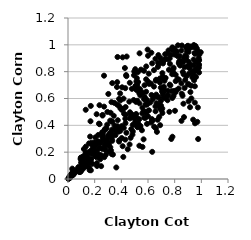
| Category | Series 0 |
|---|---|
| 0.7836342504068851 | 0.805 |
| 0.5610615064754484 | 0.641 |
| 0.04253485079842576 | 0.037 |
| 0.919891491295028 | 0.851 |
| 0.9515869209305778 | 0.691 |
| 0.5205785303169262 | 0.39 |
| 0.3262155400384781 | 0.573 |
| 0.6446854060187953 | 0.811 |
| 0.535160524778381 | 0.248 |
| 0.5935872876621674 | 0.503 |
| 0.534909024585252 | 0.446 |
| 0.2595380502048091 | 0.343 |
| 0.8655837116887714 | 0.561 |
| 0.13361825662190904 | 0.241 |
| 0.6056085689123091 | 0.785 |
| 0.20532825203499436 | 0.21 |
| 0.1688141165076407 | 0.43 |
| 0.10783027642858285 | 0.103 |
| 0.8670050182637795 | 0.78 |
| 0.2764689434769459 | 0.246 |
| 0.13324119266326725 | 0.173 |
| 0.9051945486520051 | 0.873 |
| 0.25927888224184875 | 0.477 |
| 0.1350354829395176 | 0.191 |
| 0.8743601571822789 | 0.679 |
| 0.032825821279329315 | 0.039 |
| 0.30267499963031913 | 0.321 |
| 0.35803701581496883 | 0.383 |
| 0.5424560325676623 | 0.384 |
| 0.37026893233019714 | 0.368 |
| 0.7836252910030995 | 0.969 |
| 0.5458763430222952 | 0.646 |
| 0.2592710910028215 | 0.31 |
| 0.9817306644293472 | 0.829 |
| 0.36732922168364524 | 0.686 |
| 0.23712059282582626 | 0.409 |
| 0.9587434187647836 | 0.869 |
| 0.9112938751995172 | 0.84 |
| 0.18794761554298456 | 0.2 |
| 0.5696512092485299 | 0.806 |
| 0.9761535961713298 | 0.298 |
| 0.1330325787023337 | 0.516 |
| 0.8441632748105674 | 0.881 |
| 0.09441787526968488 | 0.149 |
| 0.42963028463660735 | 0.449 |
| 0.25678347864624784 | 0.349 |
| 0.9414454121000605 | 0.848 |
| 0.6870681243370528 | 0.529 |
| 0.4718904579547721 | 0.475 |
| 0.5366587110782195 | 0.937 |
| 0.7826272741505005 | 0.604 |
| 0.21505620234439843 | 0.211 |
| 0.12257094637206437 | 0.121 |
| 0.19162183388206872 | 0.23 |
| 0.012228305892225474 | 0.02 |
| 0.08497778606495338 | 0.053 |
| 0.24195788789625264 | 0.147 |
| 0.7277438120638807 | 0.604 |
| 0.9528020199710424 | 0.934 |
| 0.3569627657817646 | 0.36 |
| 0.7164248464082997 | 0.643 |
| 0.836388045261852 | 0.917 |
| 0.1811758119070041 | 0.189 |
| 0.6593713744134111 | 0.378 |
| 0.1716184984122249 | 0.065 |
| 0.7079854282561578 | 0.492 |
| 0.887742561320369 | 0.765 |
| 0.8225464070149779 | 0.745 |
| 0.9399253503604587 | 0.792 |
| 0.5014864261002099 | 0.407 |
| 0.6222263062255006 | 0.711 |
| 0.32364193463691143 | 0.313 |
| 0.6884708741459176 | 0.749 |
| 0.7629904270691321 | 0.704 |
| 0.47453201417991225 | 0.372 |
| 0.22683987868806646 | 0.328 |
| 0.5422198982311248 | 0.668 |
| 0.426711481232801 | 0.827 |
| 0.0363782953368485 | 0.049 |
| 0.11040940128148442 | 0.166 |
| 0.024563854678855294 | 0.023 |
| 0.9332771118689898 | 0.799 |
| 0.1425951003818985 | 0.17 |
| 0.1528863314693442 | 0.154 |
| 0.2842890452612577 | 0.181 |
| 0.2035293773101309 | 0.17 |
| 0.7915133482140569 | 0.963 |
| 0.16709836890116866 | 0.193 |
| 0.2606591528599608 | 0.32 |
| 0.9510864196329474 | 0.569 |
| 0.0068524915121784885 | 0.004 |
| 0.5860361646602784 | 0.743 |
| 0.7677849466444505 | 0.697 |
| 0.9666299757965925 | 0.972 |
| 0.28061807326948657 | 0.217 |
| 0.7716873250788094 | 0.925 |
| 0.5544413713032634 | 0.363 |
| 0.5704808339654581 | 0.595 |
| 0.48020988595019376 | 0.464 |
| 0.5424256246201633 | 0.623 |
| 0.09738600316323406 | 0.057 |
| 0.572227929431 | 0.457 |
| 0.13409205110806047 | 0.109 |
| 0.5741111100016631 | 0.699 |
| 0.6642555693954686 | 0.565 |
| 0.3263997372313648 | 0.332 |
| 0.9637957779567464 | 0.808 |
| 0.38332390357631213 | 0.597 |
| 0.3222127745733256 | 0.348 |
| 0.11057872092615294 | 0.14 |
| 0.514640309522878 | 0.459 |
| 0.4634987756782277 | 0.717 |
| 0.8859332826750396 | 0.979 |
| 0.9044468148687503 | 0.579 |
| 0.7813589759911069 | 0.781 |
| 0.3271241369876705 | 0.186 |
| 0.07926225807148951 | 0.056 |
| 0.7782652049029435 | 0.655 |
| 0.12295453079391357 | 0.175 |
| 0.05287051434511445 | 0.058 |
| 0.24312128135219788 | 0.268 |
| 0.9488324230369898 | 0.938 |
| 0.14986530997600658 | 0.138 |
| 0.4031088951298152 | 0.516 |
| 0.9238090531202623 | 0.695 |
| 0.5867123418497034 | 0.839 |
| 0.6964143117082784 | 0.582 |
| 0.9670014349147732 | 0.943 |
| 0.27689757736042014 | 0.365 |
| 0.3599441634581176 | 0.357 |
| 0.33191755539467765 | 0.715 |
| 0.626387371202488 | 0.626 |
| 0.15204545936819508 | 0.134 |
| 0.9038742301631937 | 0.947 |
| 0.23610347014046976 | 0.55 |
| 0.822017863629243 | 0.915 |
| 0.3924261134031154 | 0.359 |
| 0.558306492502851 | 0.532 |
| 0.5149265396519943 | 0.664 |
| 0.5176370904666233 | 0.7 |
| 0.42974661900107014 | 0.677 |
| 0.6670209246698613 | 0.351 |
| 0.5093509846798908 | 0.575 |
| 0.5045507806778612 | 0.819 |
| 0.34670697953051716 | 0.568 |
| 0.4295321046530319 | 0.293 |
| 0.7109127055608829 | 0.631 |
| 0.27300403250683014 | 0.287 |
| 0.08605168220441656 | 0.076 |
| 0.356038258137315 | 0.327 |
| 0.38294355092932697 | 0.279 |
| 0.22474986976422578 | 0.178 |
| 0.04010199040089313 | 0.031 |
| 0.45983457942006795 | 0.577 |
| 0.27650658375352605 | 0.372 |
| 0.8699822472818761 | 0.461 |
| 0.497074842817009 | 0.802 |
| 0.0038043331004514657 | 0.003 |
| 0.6007583573000377 | 0.726 |
| 0.9035387737002814 | 0.843 |
| 0.011265466623986585 | 0.011 |
| 0.9589785983469751 | 0.759 |
| 0.4045433981877948 | 0.519 |
| 0.7111208629227787 | 0.762 |
| 0.19267030536697924 | 0.208 |
| 0.11062912517734452 | 0.074 |
| 0.5248580293881849 | 0.419 |
| 0.7826408919828249 | 0.98 |
| 0.10637519694739099 | 0.126 |
| 0.8244402500037893 | 0.996 |
| 0.8069233034270423 | 0.955 |
| 0.7157932103250816 | 0.607 |
| 0.27068111821212815 | 0.539 |
| 0.11917764597801551 | 0.223 |
| 0.6558796176243049 | 0.896 |
| 0.7077905228257287 | 0.789 |
| 0.14047513848605342 | 0.1 |
| 0.9526415718387587 | 0.415 |
| 0.5913401305096545 | 0.591 |
| 0.43116478059100316 | 0.417 |
| 0.4950841686361935 | 0.774 |
| 0.9386814635409755 | 0.442 |
| 0.029537385042505714 | 0.026 |
| 0.9456350514796672 | 0.736 |
| 0.8509923986562751 | 0.713 |
| 0.37900394316934943 | 0.353 |
| 0.16095330313955886 | 0.129 |
| 0.30201675527551675 | 0.324 |
| 0.8076945644307832 | 0.729 |
| 0.6646597859041016 | 0.613 |
| 0.15744548934908492 | 0.265 |
| 0.24775471328107587 | 0.177 |
| 0.3370061595321673 | 0.182 |
| 0.020875380017094484 | 0.034 |
| 0.3080688869714902 | 0.205 |
| 0.4862811628049438 | 0.354 |
| 0.29387610097104483 | 0.302 |
| 0.9061629733746279 | 0.783 |
| 0.894010690356628 | 0.838 |
| 0.9808833147173115 | 0.888 |
| 0.5258243181658103 | 0.723 |
| 0.1779391125006688 | 0.271 |
| 0.830052390853189 | 0.674 |
| 0.33210449940518355 | 0.285 |
| 0.029109592936268813 | 0.042 |
| 0.1043956518891998 | 0.106 |
| 0.7832945805680482 | 0.315 |
| 0.137033969581061 | 0.106 |
| 0.9252480836839286 | 0.601 |
| 0.5948156221365792 | 0.558 |
| 0.020671301865685266 | 0.02 |
| 0.7236874126608916 | 0.732 |
| 0.5210233719876468 | 0.386 |
| 0.29556580904234137 | 0.25 |
| 0.6073837001314768 | 0.512 |
| 0.747674768510308 | 0.936 |
| 0.030766748163459173 | 0.026 |
| 0.7914551010198689 | 0.619 |
| 0.31070712364972564 | 0.324 |
| 0.19043989199974506 | 0.235 |
| 0.0776470600537082 | 0.088 |
| 0.4833674373762689 | 0.33 |
| 0.4321514121701264 | 0.536 |
| 0.40329635216126025 | 0.394 |
| 0.7903863762593618 | 0.821 |
| 0.983289768368837 | 0.885 |
| 0.3682420418985082 | 0.555 |
| 0.656448835549177 | 0.505 |
| 0.7571899881519264 | 0.814 |
| 0.3196776894422961 | 0.494 |
| 0.7071372236132467 | 0.526 |
| 0.032231023727963735 | 0.077 |
| 0.4480596518510241 | 0.222 |
| 0.8142284959996465 | 0.661 |
| 0.5566579636884914 | 0.489 |
| 0.4620873290035026 | 0.257 |
| 0.13683002631151178 | 0.154 |
| 0.09793165447313347 | 0.122 |
| 0.8506292046891571 | 0.957 |
| 0.9459363964329232 | 0.803 |
| 0.22963656057598392 | 0.227 |
| 0.6586767920812567 | 0.733 |
| 0.09054605069815674 | 0.052 |
| 0.5586132850935173 | 0.239 |
| 0.19438967130145224 | 0.194 |
| 0.11004782452228187 | 0.111 |
| 0.21771461373087958 | 0.097 |
| 0.2939422891401281 | 0.405 |
| 0.011116534933453137 | 0.013 |
| 0.009561432556851145 | 0.006 |
| 0.9181570681134394 | 0.648 |
| 0.2952332722569556 | 0.5 |
| 0.3622599260689898 | 0.086 |
| 0.46942206476297443 | 0.307 |
| 0.8163182794573406 | 0.95 |
| 0.30254392220840254 | 0.634 |
| 0.24861002457858328 | 0.096 |
| 0.8414550526376748 | 0.846 |
| 0.7076231807522518 | 0.88 |
| 0.5753966364717134 | 0.61 |
| 0.7834935146353175 | 0.977 |
| 0.9798926652995741 | 0.902 |
| 0.631451038389089 | 0.202 |
| 0.3238526098112166 | 0.336 |
| 0.14704951873048597 | 0.093 |
| 0.6357622402391256 | 0.436 |
| 0.485762752329635 | 0.404 |
| 0.3934970571628466 | 0.586 |
| 0.5360260167401752 | 0.564 |
| 0.8792576307999055 | 0.738 |
| 0.6176272079697361 | 0.57 |
| 0.7744894800922796 | 0.298 |
| 0.16214986758787187 | 0.066 |
| 0.8076150535889263 | 0.777 |
| 0.9827387801510663 | 0.854 |
| 0.38477771535704586 | 0.289 |
| 0.5887300335160209 | 0.554 |
| 0.8638256686011576 | 0.871 |
| 0.9544741743800916 | 0.817 |
| 0.786495014297598 | 0.96 |
| 0.10971632531939149 | 0.134 |
| 0.21523876223251712 | 0.161 |
| 0.8058321510309349 | 0.646 |
| 0.74930701337199 | 0.892 |
| 0.40993693811176357 | 0.245 |
| 0.46463743531469526 | 0.497 |
| 0.4146175567214275 | 0.521 |
| 0.6845077318387539 | 0.463 |
| 0.25735218318324266 | 0.224 |
| 0.18338893733346037 | 0.113 |
| 0.04508362697099221 | 0.045 |
| 0.10587039386459116 | 0.142 |
| 0.9130370049301854 | 0.823 |
| 0.41849046821893376 | 0.381 |
| 0.17099103703002952 | 0.545 |
| 0.6294981507672247 | 0.446 |
| 0.6399102883799391 | 0.615 |
| 0.034326803451311824 | 0.07 |
| 0.9733237524440608 | 0.954 |
| 0.09611389683674065 | 0.078 |
| 0.5668498267320204 | 0.296 |
| 0.8590916988243759 | 0.621 |
| 0.34307233451632424 | 0.471 |
| 0.6002995255284508 | 0.467 |
| 0.03485596745401002 | 0.046 |
| 0.6000120827016069 | 0.919 |
| 0.8883311571375736 | 0.911 |
| 0.8998021200401852 | 0.993 |
| 0.8714863055593917 | 0.905 |
| 0.8863345188830059 | 0.89 |
| 0.505204595065919 | 0.693 |
| 0.3839770685992716 | 0.543 |
| 0.6459274577924962 | 0.39 |
| 0.40301203937959607 | 0.305 |
| 0.01986275523304815 | 0.029 |
| 0.02757475492894427 | 0.035 |
| 0.4929877831620017 | 0.589 |
| 0.6742079605107384 | 0.836 |
| 0.8542350902843547 | 0.995 |
| 0.3067165514737481 | 0.259 |
| 0.05614428223756075 | 0.06 |
| 0.7208203279104927 | 0.746 |
| 0.6348876664146957 | 0.593 |
| 0.1658752466094719 | 0.316 |
| 0.15606638771267828 | 0.201 |
| 0.7515539334960832 | 0.624 |
| 0.07951421797629563 | 0.087 |
| 0.7987692504677983 | 0.927 |
| 0.6083626464276656 | 0.709 |
| 0.6957788288965371 | 0.68 |
| 0.9154256852626704 | 0.535 |
| 0.934849076437791 | 0.983 |
| 0.001971498184763978 | 0.001 |
| 0.23209863155457722 | 0.413 |
| 0.3275375072178403 | 0.428 |
| 0.32859965557557064 | 0.302 |
| 0.74657109487378 | 0.587 |
| 0.9175619117875875 | 0.985 |
| 0.8923870244972278 | 0.95 |
| 0.42062131397238933 | 0.486 |
| 0.6908586851012376 | 0.401 |
| 0.27785416876000524 | 0.261 |
| 0.13333907593864286 | 0.196 |
| 0.7290016197606954 | 0.896 |
| 0.015999263000622595 | 0.009 |
| 0.6755522267737167 | 0.867 |
| 0.7971269301336773 | 0.972 |
| 0.48827786832133285 | 0.469 |
| 0.900369261120439 | 0.705 |
| 0.15231710128810444 | 0.126 |
| 0.20483547931032337 | 0.31 |
| 0.38385212265724045 | 0.375 |
| 0.4380386401323191 | 0.345 |
| 0.29089622239394547 | 0.275 |
| 0.4401506565661471 | 0.913 |
| 0.43810780754677964 | 0.767 |
| 0.25342757364578644 | 0.283 |
| 0.8024134783565795 | 0.508 |
| 0.3714870645836961 | 0.393 |
| 0.23449132653130433 | 0.268 |
| 0.47923551367935796 | 0.481 |
| 0.9812466354209001 | 0.847 |
| 0.6795025389477755 | 0.61 |
| 0.09741453643930545 | 0.157 |
| 0.6606601854283898 | 0.74 |
| 0.8366246261355161 | 0.854 |
| 0.22435986271987046 | 0.281 |
| 0.6555589572320099 | 0.541 |
| 0.2722372027504745 | 0.163 |
| 0.4793396374968392 | 0.672 |
| 0.7602361683636253 | 0.501 |
| 0.9955339351905771 | 0.945 |
| 0.3690103086457127 | 0.722 |
| 0.33058117631188005 | 0.368 |
| 0.5971461074333165 | 0.964 |
| 0.19982772624681816 | 0.242 |
| 0.5800145223323931 | 0.455 |
| 0.9830620072830832 | 0.793 |
| 0.7126669711366619 | 0.861 |
| 0.31741322337328937 | 0.236 |
| 0.9394495089573958 | 0.771 |
| 0.49557655183310584 | 0.452 |
| 0.31644144969928206 | 0.435 |
| 0.6805829128887977 | 0.856 |
| 0.229666526117614 | 0.184 |
| 0.6231315161519567 | 0.422 |
| 0.6779829160776755 | 0.924 |
| 0.15846892749206637 | 0.12 |
| 0.9324883476857415 | 0.757 |
| 0.9564943325231634 | 0.991 |
| 0.7111732133163785 | 0.876 |
| 0.2388440702161063 | 0.233 |
| 0.2886191118984286 | 0.378 |
| 0.9567957305134505 | 0.762 |
| 0.6445238366253782 | 0.689 |
| 0.5234454104440447 | 0.796 |
| 0.6893609479028185 | 0.719 |
| 0.04643220531507209 | 0.041 |
| 0.12650754980639978 | 0.091 |
| 0.43587057830357 | 0.775 |
| 0.7063332935236595 | 0.755 |
| 0.9051071676487742 | 0.967 |
| 0.3491766466247901 | 0.399 |
| 0.9615070427740815 | 0.974 |
| 0.5108293222304686 | 0.484 |
| 0.5130371872011856 | 0.727 |
| 0.4098415640140913 | 0.907 |
| 0.7192818947883346 | 0.687 |
| 0.519291955696966 | 0.583 |
| 0.8510188713138795 | 0.434 |
| 0.14486268010399658 | 0.132 |
| 0.7966647080222824 | 0.657 |
| 0.2918633944896065 | 0.264 |
| 0.2983903902334566 | 0.277 |
| 0.5344461514137832 | 0.639 |
| 0.7286999989163859 | 0.93 |
| 0.4164264531628249 | 0.599 |
| 0.5470133654801188 | 0.815 |
| 0.8790461850417728 | 0.921 |
| 0.9701485739486181 | 0.426 |
| 0.7644148686742077 | 0.858 |
| 0.01158039009140572 | 0.016 |
| 0.701505586864028 | 0.513 |
| 0.5128095623886411 | 0.666 |
| 0.2165814944949066 | 0.118 |
| 0.25897065452556345 | 0.473 |
| 0.07997223718519768 | 0.064 |
| 0.5159304371260436 | 0.752 |
| 0.9041525811744945 | 0.707 |
| 0.7916304873208345 | 0.83 |
| 0.6722298878657669 | 0.441 |
| 0.2601758401538865 | 0.334 |
| 0.7538297399931094 | 0.958 |
| 0.320131581456971 | 0.339 |
| 0.6252028992684789 | 0.941 |
| 0.39344308634775876 | 0.526 |
| 0.7937097884037322 | 0.787 |
| 0.3326022490258549 | 0.429 |
| 0.37328608246058914 | 0.438 |
| 0.4102362748149963 | 0.523 |
| 0.8738210756769265 | 0.834 |
| 0.8532102021586129 | 0.636 |
| 0.6926793703814828 | 0.902 |
| 0.5792013647339288 | 0.495 |
| 0.10144403277134023 | 0.146 |
| 0.6312778928246892 | 0.862 |
| 0.8612509808391116 | 0.797 |
| 0.27026013310816804 | 0.77 |
| 0.31257964420499995 | 0.341 |
| 0.07662700820930103 | 0.08 |
| 0.17386160458881356 | 0.15 |
| 0.566923493061812 | 0.506 |
| 0.01558935754225271 | 0.015 |
| 0.5322453930975702 | 0.673 |
| 0.8934441970933539 | 0.989 |
| 0.3229753572124319 | 0.212 |
| 0.7628934866413731 | 0.899 |
| 0.5423162637853994 | 0.396 |
| 0.504413717400398 | 0.424 |
| 0.7320886296840892 | 0.753 |
| 0.9739981729310551 | 0.533 |
| 0.10554676560184122 | 0.101 |
| 0.20007928498606195 | 0.273 |
| 0.2903466818943175 | 0.29 |
| 0.21475347582665127 | 0.483 |
| 0.16021703363591924 | 0.082 |
| 0.9441684711239051 | 0.999 |
| 0.6614541474555633 | 0.629 |
| 0.705170185454414 | 0.652 |
| 0.21140255330884325 | 0.254 |
| 0.19222932809925006 | 0.218 |
| 0.3714154500113298 | 0.909 |
| 0.592645067977561 | 0.411 |
| 0.9854180417297533 | 0.928 |
| 0.7169943708335611 | 0.663 |
| 0.7483503414634712 | 0.658 |
| 0.18123943048185723 | 0.254 |
| 0.6823725835390538 | 0.549 |
| 0.4332191785916822 | 0.479 |
| 0.8313241039874203 | 0.741 |
| 0.09297976074042347 | 0.071 |
| 0.17179126059709837 | 0.143 |
| 0.4147505930607594 | 0.164 |
| 0.11549984542328902 | 0.116 |
| 0.7426464821326727 | 0.618 |
| 0.6980739285314226 | 0.547 |
| 0.7190856529747726 | 0.883 |
| 0.5860660948107018 | 0.65 |
| 0.39091931686871295 | 0.638 |
| 0.5813429600122704 | 0.557 |
| 0.83094216911585 | 0.864 |
| 0.4646876431827747 | 0.451 |
| 0.8336542819663011 | 0.877 |
| 0.17611335182882548 | 0.215 |
| 0.2670158940328051 | 0.229 |
| 0.9192570893660379 | 0.987 |
| 0.40567952060982543 | 0.683 |
| 0.9418404584471044 | 0.89 |
| 0.9677120217070115 | 0.826 |
| 0.0960679114253818 | 0.16 |